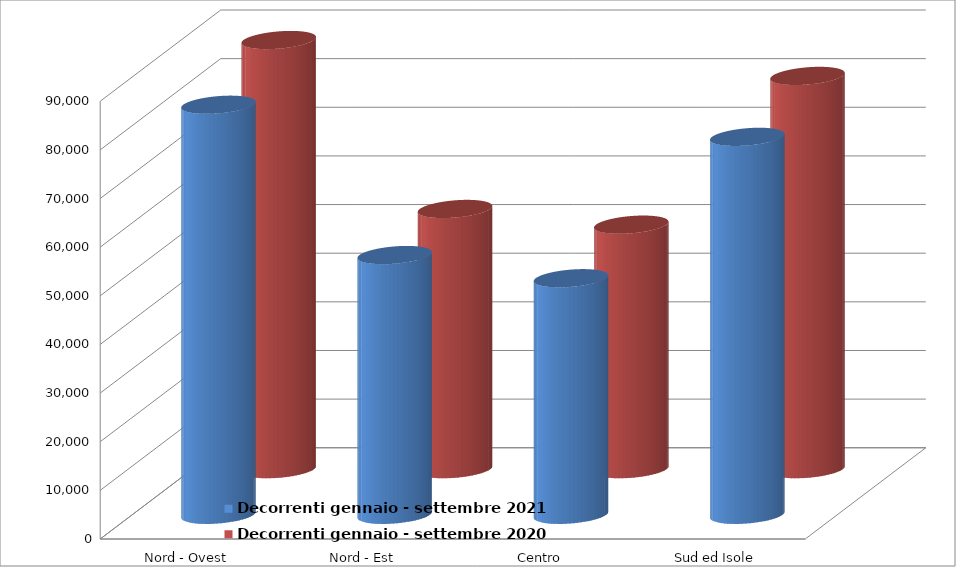
| Category | Decorrenti gennaio - settembre 2021 | Decorrenti gennaio - settembre 2020 |
|---|---|---|
| Nord - Ovest | 84307 | 88236 |
| Nord - Est | 53408 | 53502 |
| Centro | 48640 | 50275 |
| Sud ed Isole | 77707 | 80855 |